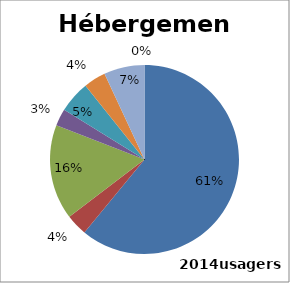
| Category | Series 0 |
|---|---|
| 0 | 60.973 |
| 1 | 3.674 |
| 2 | 16.236 |
| 3 | 2.929 |
| 4 | 5.462 |
| 5 | 3.774 |
| 6 | 6.951 |
| 7 | 0 |